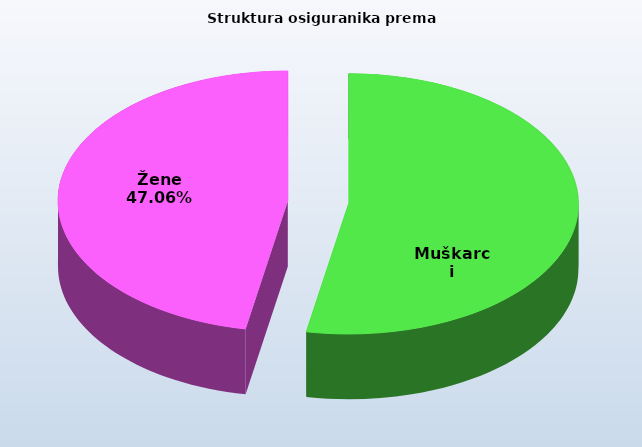
| Category | Series 0 |
|---|---|
| Muškarci | 850483 |
| Žene | 756050 |